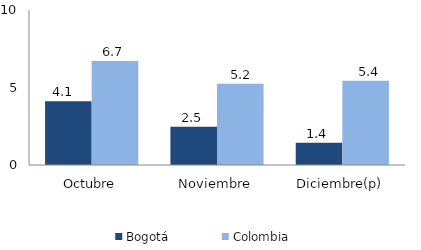
| Category | Bogotá | Colombia |
|---|---|---|
| Octubre | 4.117 | 6.705 |
| Noviembre | 2.462 | 5.238 |
| Diciembre(p) | 1.433 | 5.431 |